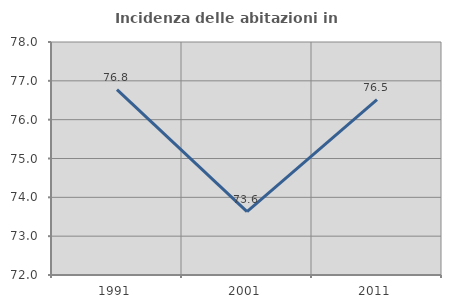
| Category | Incidenza delle abitazioni in proprietà  |
|---|---|
| 1991.0 | 76.776 |
| 2001.0 | 73.631 |
| 2011.0 | 76.519 |